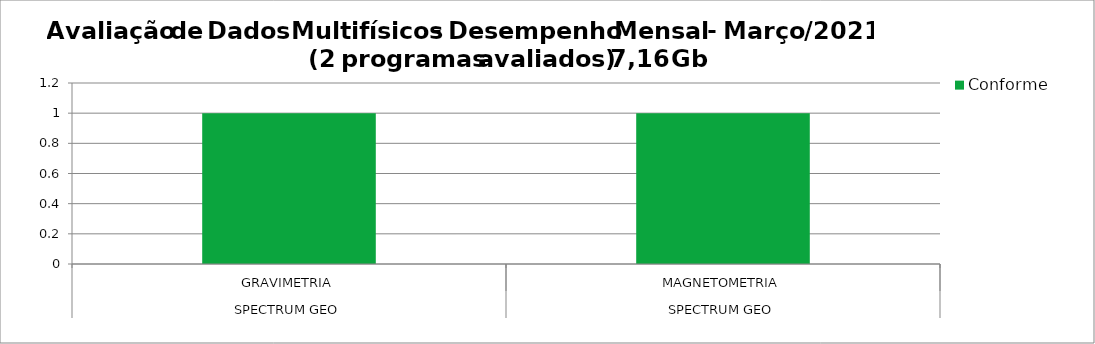
| Category | Conforme |
|---|---|
| 0 | 1 |
| 1 | 1 |